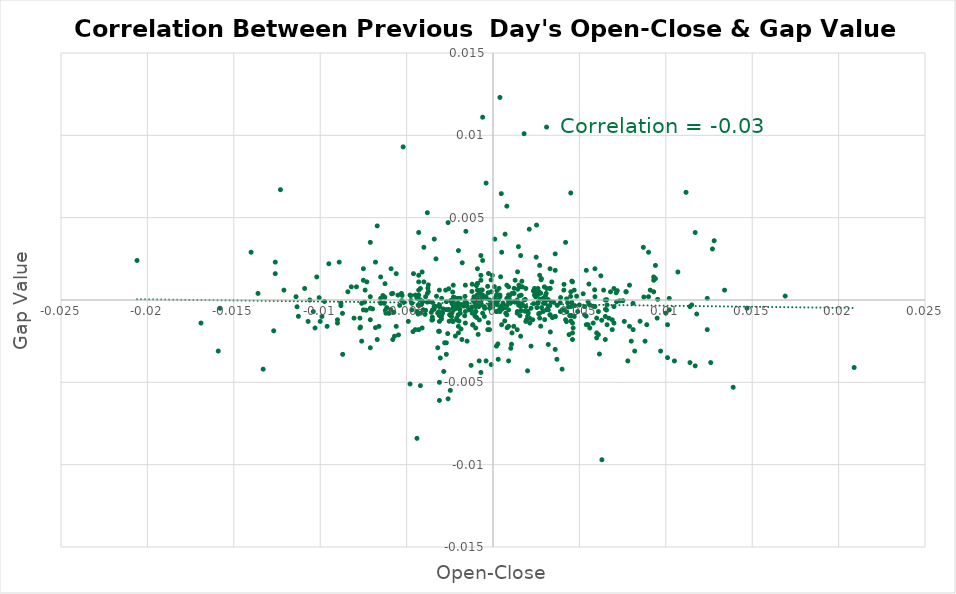
| Category | Series 0 |
|---|---|
| 0.0034399999999999986 | -0.001 |
| 0.0029200000000000337 | 0 |
| 0.0015299999999999203 | 0 |
| -0.004750000000000032 | 0 |
| -0.007340000000000013 | -0.001 |
| 0.0008199999999999319 | -0.002 |
| -0.003409999999998914 | -0.001 |
| 0.004730000000000012 | 0 |
| 0.004510000000001013 | -0.001 |
| 0.0016300000000000203 | 0 |
| 0.0025100000000000122 | 0 |
| -0.006229999999999958 | -0.001 |
| -0.005920000000000036 | -0.001 |
| -0.0011700000000000044 | -0.002 |
| 0.00713000000000108 | 0 |
| 0.0048399999999999554 | 0 |
| -0.009000000000000008 | -0.001 |
| 0.003029999999999977 | 0 |
| 0.0043199999999999905 | 0 |
| -0.005739999999999967 | -0.001 |
| -0.006249999999999978 | 0.001 |
| 0.005220000000000002 | 0 |
| -0.0043400000000000105 | -0.001 |
| 0.0016299999999999093 | -0.001 |
| 0.0025399999999999867 | 0 |
| 0.0007599999999999829 | 0 |
| -0.006020000000000025 | -0.001 |
| 0.0010299999999999754 | -0.003 |
| 0.0029599999999999627 | 0 |
| 0.004109999999999947 | 0.001 |
| 0.01690999999999898 | 0 |
| -0.010060000000001068 | 0 |
| -0.0009500000000000064 | 0 |
| -0.008040000000000047 | -0.001 |
| 0.0033199999999999896 | -0.002 |
| 0.0045399999999999885 | 0 |
| 0.007520000000000082 | 0 |
| -0.00026999999999999247 | -0.001 |
| -0.0015499999999999403 | 0 |
| -0.002970000000000028 | 0 |
| -9.999999999998899e-05 | -0.004 |
| -4.0000000000040004e-05 | 0.001 |
| 0.0009000000000000119 | 0 |
| -0.0023299999999999432 | 0 |
| -0.0020000000000000018 | 0 |
| -0.0042799999999999505 | 0 |
| 0.0016699999999999493 | 0.001 |
| 0.0002000000000010882 | -0.001 |
| -0.0024500000000010624 | 0 |
| 0.0015600000000000058 | -0.001 |
| -0.007669999999999955 | -0.002 |
| 0.0016599999999999948 | 0 |
| 0.0016599999999999948 | 0 |
| 0.0014300000000000423 | 0.001 |
| -0.0016400000000000858 | -0.001 |
| -0.0018299999999999983 | 0 |
| -0.011260000000000048 | -0.001 |
| 0.002989999999999937 | -0.001 |
| -0.0025399999999999867 | -0.001 |
| 0.00714999999999999 | 0 |
| 0.0046399999999999775 | -0.002 |
| -0.0008599999999999719 | -0.002 |
| -0.0029799999999999827 | -0.001 |
| 0.0009799999999999809 | 0 |
| -0.0019699999999999163 | -0.001 |
| 0.0020400000000000418 | -0.001 |
| 0.0010700000000000154 | -0.003 |
| -0.003049999999999997 | -0.004 |
| -0.0023100000000000342 | 0 |
| -0.0035399999999999876 | -0.001 |
| 0.002809999999999979 | 0 |
| 0.0042600000000000415 | 0 |
| -0.003929999999999989 | -0.001 |
| 0.008509999999998907 | -0.001 |
| -0.003149999999999986 | -0.002 |
| -0.004330000000000056 | 0 |
| -0.0012099999999999334 | 0 |
| 0.006240000000000023 | 0.001 |
| -0.012689999999999979 | -0.002 |
| -0.006369999999999987 | 0 |
| 0.011170000000000013 | 0.007 |
| -0.002849999999999908 | -0.004 |
| 0.006160000000000054 | -0.003 |
| -0.0012699999999999934 | -0.004 |
| 0.0003500000000010717 | 0.001 |
| 0.005390000000000006 | -0.001 |
| 0.0031999999999999806 | 0 |
| 0.0021299999999999653 | -0.001 |
| 0.0023500000000000743 | 0 |
| -0.004129999999999967 | 0 |
| 0.004269999999999996 | -0.001 |
| -0.0038000000000000256 | 0 |
| -0.0013700000000000934 | -0.001 |
| 0.005549999999999944 | 0.001 |
| -0.0009500000000000064 | -0.001 |
| 0.0012799999999999478 | 0.001 |
| 0.0002300000000000635 | 0.001 |
| -0.003570000000000073 | -0.001 |
| 0.003720000000001056 | 0 |
| -0.0020499999999999963 | 0 |
| -0.00040999999999991044 | 0 |
| -0.0029799999999999827 | -0.001 |
| -0.0030999999999999917 | 0 |
| -0.0023699999999999832 | -0.001 |
| -0.0017000000000000348 | 0 |
| 0.002970000000000028 | 0.001 |
| -0.0011700000000000044 | -0.002 |
| -0.0034999999999999476 | -0.001 |
| -0.0007899999999999574 | -0.001 |
| 0.0006800000000010131 | -0.001 |
| 9.00000000000345e-05 | 0 |
| 0.0017500000000000293 | 0 |
| 0.0005100000000000104 | -0.001 |
| 0.004370000000000096 | 0 |
| 0.003290000000000015 | 0 |
| -0.004249999999999976 | 0 |
| 0.0045600000000000085 | 0 |
| -0.0012199999999999989 | 0.001 |
| -0.00027999999999994696 | 0 |
| 0.004490000000001104 | 0 |
| -0.0022900000000000142 | 0 |
| -0.0022199999999999998 | 0 |
| -0.0027400000000000757 | 0.001 |
| 0.0025200000000000777 | 0.005 |
| -0.0010399999999999299 | -0.001 |
| -0.0024699999999999722 | -0.005 |
| -0.0021100000000000563 | 0 |
| -0.00019000000000002348 | 0 |
| -0.005159999999999942 | 0 |
| 0.0007899999999999574 | 0 |
| -0.0017800000000000038 | 0.002 |
| 0.003190000000000026 | 0 |
| -0.0016199999999989556 | 0 |
| -0.0029200000000000337 | -0.001 |
| 0.0014700000000000824 | 0.003 |
| -0.0037399999999999656 | 0.001 |
| -0.003330000000000055 | 0 |
| 0.0012099999999989342 | 0 |
| 0.002610000000000001 | 0 |
| -0.008799999999999919 | 0 |
| 0.0030800000000000827 | 0 |
| -0.0031300000000010764 | -0.001 |
| -0.011340000000000017 | 0 |
| -0.0007700000000000484 | 0.001 |
| 0.007189999999999919 | 0.001 |
| 0.0050000000000000044 | 0 |
| 0.0027599999999999847 | -0.002 |
| 0.00047999999999892573 | 0.006 |
| 0.0027199999999989455 | 0 |
| -0.005470000000000086 | -0.002 |
| 0.003130000000000077 | -0.001 |
| 0.00027999999999994696 | -0.001 |
| -0.0007800000000000029 | 0 |
| -0.0022600000000000398 | -0.001 |
| 0.0006800000000000139 | 0 |
| 0.0027599999999999847 | 0 |
| -0.0009599999999999609 | 0.001 |
| 0.00027999999999994696 | -0.003 |
| 0.003909999999999969 | 0 |
| 0.009530000000001038 | 0 |
| 0.007330000000000059 | 0 |
| -0.007439999999998892 | 0 |
| -0.00539999999999996 | 0 |
| 0.008110000000000062 | -0.002 |
| -0.003510000000000013 | 0 |
| -0.0023600000000000287 | 0 |
| -0.006260000000000043 | 0 |
| -0.0014799999999989266 | 0 |
| -0.003770000000000051 | 0.001 |
| -0.005280000000001062 | 0 |
| -0.006149999999999989 | 0 |
| 0.0035200000000000786 | 0 |
| 0.0026399999999999757 | -0.001 |
| -2.0000000000020002e-05 | 0 |
| 0.0027800000000000047 | 0.001 |
| -0.0001100000000010537 | 0.001 |
| -0.0011700000000000044 | 0 |
| -0.0008199999999999319 | 0 |
| -0.002890000000000059 | -0.001 |
| 0.005789999999999962 | 0 |
| -0.0006200000000000649 | 0.001 |
| 0.0009600000000010711 | 0 |
| -0.00031000000000003247 | 0.001 |
| 7.999999999996898e-05 | 0.001 |
| 0.008730000000000016 | 0 |
| -0.005870000000000042 | 0 |
| -0.0007000000000000339 | 0 |
| 0.0005800000000000249 | 0 |
| 0.0033700000000010943 | 0 |
| -0.003269999999999995 | 0 |
| 0.011790000000001077 | -0.001 |
| -0.008709999999999996 | -0.001 |
| 0.0014200000000000879 | 0.002 |
| -0.0023199999999999887 | -0.001 |
| 0.00012000000000000899 | 0 |
| 0.0026800000000000157 | 0 |
| 0.00021999999999999797 | 0 |
| -0.004630000000000023 | -0.002 |
| 0.0012199999999999989 | 0 |
| 0.0024699999999999722 | 0 |
| 0.0020199999999999108 | -0.001 |
| 0.0065800000000010295 | 0 |
| -0.0020000000000000018 | 0 |
| 0.005879999999999996 | 0.001 |
| -0.006970000000000032 | -0.001 |
| 0.0018500000000000183 | -0.001 |
| 0.0023400000000000087 | 0.001 |
| -0.003510000000000013 | -0.001 |
| 0.00021999999999999797 | 0 |
| -0.0007300000000010076 | 0 |
| -0.0021799999999999597 | -0.002 |
| -0.0030999999999999917 | -0.001 |
| -0.0040999999999999925 | 0 |
| -0.0016100000000000003 | 0 |
| 0.0019299999999999873 | -0.001 |
| -0.0020200000000000218 | -0.001 |
| 0.004530000000000034 | -0.001 |
| -0.009749999999999925 | 0 |
| -0.0019200000000000328 | -0.001 |
| -0.00048000000000003595 | -0.001 |
| -0.00273000000000001 | -0.001 |
| -0.004070000000001017 | 0 |
| 0.0015199999999999658 | 0 |
| -0.006800000000000028 | -0.002 |
| 0.0007399999999999629 | -0.001 |
| -0.0039000000000000146 | -0.001 |
| -0.0007700000000010476 | 0 |
| -0.0008300000000011076 | 0 |
| -0.0026199999999999557 | -0.002 |
| -0.0015700000000000713 | 0.004 |
| -0.0010200000000000209 | 0 |
| 0.0044399999999999995 | -0.001 |
| 0.0013499999999999623 | 0 |
| 0.00043999999999999595 | 0.001 |
| -0.0021399999999999197 | 0 |
| -0.0037399999999999656 | 0.001 |
| -0.0023699999999999832 | -0.001 |
| 0.004560000000001008 | 0.001 |
| 0.002569999999999961 | 0 |
| -0.005260000000000042 | 0 |
| -0.002569999999999961 | -0.001 |
| -0.0011999999999999789 | 0.001 |
| 0.00048000000000003595 | 0 |
| -0.0018500000000000183 | -0.002 |
| 0.00389000000000006 | 0 |
| 0.0014100000000000223 | -0.001 |
| 0.004250000000000087 | -0.001 |
| 0.006290000000000018 | -0.001 |
| 0.0014800000000000368 | 0 |
| -0.0040400000000000436 | -0.001 |
| -0.0025600000000000067 | 0.001 |
| 0.006570000000000076 | -0.001 |
| 0.006510000000000016 | -0.001 |
| 0.0012199999999999989 | 0.001 |
| -0.0009500000000000064 | 0 |
| 0.0018700000000010375 | 0 |
| -0.004749999999999921 | 0 |
| -0.00025999999999992696 | 0.002 |
| -0.0023000000000000798 | 0 |
| 0.0021999999999999797 | 0 |
| 0.0022999999999999687 | -0.001 |
| 0.010199999999999987 | 0 |
| -0.0019000000000000128 | 0 |
| 0.005299999999999971 | 0 |
| 0.006099999999999994 | -0.002 |
| 0.0046999999999999265 | 0.001 |
| 0.0008999999999999009 | 0 |
| -0.00990000000000002 | -0.001 |
| 0.0030000000000000027 | 0 |
| 0.00539999999999996 | 0.002 |
| -0.00880000000000003 | 0 |
| -0.0048000000000000265 | -0.005 |
| 0.013900000000000023 | -0.005 |
| -0.0034000000000000696 | 0.004 |
| 0.005499999999999949 | 0 |
| -0.013600000000000056 | 0 |
| 0.0040000000000000036 | -0.001 |
| 0.00040000000000006697 | 0 |
| 0.00539999999999996 | -0.002 |
| 0.009499999999999953 | -0.001 |
| 0.0020000000000000018 | -0.001 |
| 0.0026999999999999247 | -0.001 |
| -0.0030999999999999917 | -0.006 |
| -0.0047000000000000375 | -0.001 |
| -0.0018999999999989026 | -0.001 |
| 0.0018999999999989026 | 0.001 |
| 0.0039000000000000146 | -0.001 |
| -0.010700000000000043 | -0.001 |
| -0.008700000000000041 | -0.003 |
| 0.011399999999999966 | 0 |
| 0.0009000000000000119 | 0.001 |
| -9.999999999998899e-05 | 0 |
| 0.013399999999999967 | 0.001 |
| 0.0 | 0 |
| -0.00040000000000006697 | 0 |
| 0.012400000000000078 | -0.002 |
| 0.005900000000000016 | 0.002 |
| -0.0027999999999999137 | -0.003 |
| -0.0041999999999999815 | 0.001 |
| -0.0046999999999999265 | 0 |
| 0.009299999999999975 | 0.001 |
| 0.00029999999999996696 | 0 |
| 0.0030999999999999917 | 0 |
| -0.0044000000000000705 | -0.001 |
| -0.00019999999999997797 | -0.001 |
| 0.010099999999999998 | -0.001 |
| -0.005600000000000049 | -0.002 |
| -0.0010000000000000009 | -0.001 |
| 0.006000000000000005 | -0.001 |
| -0.007699999999999929 | -0.001 |
| -0.0023999999999989585 | 0 |
| -0.0027000000000000357 | 0 |
| -0.0024999999999999467 | -0.001 |
| -0.0020999999999999908 | -0.001 |
| 0.010700000000000043 | 0.002 |
| -0.00029999999999996696 | -0.002 |
| 0.002100000000000102 | -0.001 |
| -0.0019000000000000128 | 0 |
| -0.007500000000000062 | -0.001 |
| -0.0009000000000000119 | 0.001 |
| 0.006900000000001016 | -0.001 |
| 0.0032999999999999696 | 0.001 |
| 0.000200000000000089 | -0.003 |
| 0.011700000000000044 | -0.004 |
| 0.008199999999999985 | -0.003 |
| 0.0027000000000000357 | -0.001 |
| 0.0026999999999999247 | 0.002 |
| 0.006799999999998918 | 0 |
| 0.00039999999999895675 | 0 |
| 0.006099999999999994 | -0.001 |
| 0.0044999999999999485 | 0 |
| -0.0020999999999999908 | -0.001 |
| 0.005800000000000027 | -0.001 |
| -0.0044000000000000705 | 0 |
| 0.0020999999999999908 | 0.004 |
| 0.001400000000001067 | -0.001 |
| -0.0040000000000000036 | 0.001 |
| 0.007899999999999907 | -0.002 |
| -0.012600000000001055 | 0.002 |
| 0.006500000000000061 | -0.001 |
| 0.00660000000000005 | 0 |
| -0.0010000000000000009 | 0 |
| -0.005499999999999949 | 0 |
| -0.0030999999999999917 | 0.001 |
| 0.000300000000000078 | -0.004 |
| -0.0004999999999999449 | -0.001 |
| 0.010499999999998955 | -0.004 |
| -0.0011999999999999789 | -0.001 |
| -0.008199999999999985 | 0.001 |
| 0.0046000000000000485 | -0.002 |
| 0.00040000000000006697 | 0 |
| 0.0013999999999999568 | 0 |
| 0.0025000000000000577 | 0.001 |
| 0.005599999999999938 | -0.002 |
| 0.0036999999999999256 | -0.004 |
| -0.005299999999999971 | 0 |
| -0.0032999999999999696 | 0.002 |
| -0.007499999999999951 | 0.001 |
| 0.004000000000001003 | -0.004 |
| -0.0038000000000000256 | 0 |
| 0.0008000000000000229 | 0.001 |
| 0.009099999999999997 | 0.001 |
| 0.012400000000001077 | 0 |
| 0.0020999999999989916 | -0.001 |
| 0.006400000000000072 | 0.001 |
| 0.006500000000000061 | -0.002 |
| -0.0030999999999999917 | -0.001 |
| 0.0019000000000000128 | -0.001 |
| -0.0011999999999999789 | -0.001 |
| -0.0004999999999999449 | 0 |
| -0.0007000000000000339 | 0 |
| -0.0022999999999999687 | 0 |
| 0.0018000000000000238 | 0 |
| -0.0048000000000000265 | 0 |
| 0.00019999999999897877 | -0.001 |
| -0.0018000000000000238 | 0 |
| -0.0010999999999999899 | 0 |
| 0.0008000000000000229 | -0.001 |
| 0.0024000000000000687 | 0 |
| 0.00019999999999997797 | 0 |
| -0.0007000000000000339 | 0 |
| -0.0006000000000000449 | 0 |
| -0.0006000000000000449 | 0 |
| 0.0010000000000000009 | 0 |
| -0.0009000000000000119 | 0.001 |
| -0.0015999999999999348 | -0.001 |
| -0.000200000000000089 | 0 |
| 0.0015999999999989356 | 0 |
| -0.006200000000000094 | -0.001 |
| 0.0010999999999999899 | 0 |
| -0.0046000000000000485 | 0.002 |
| 0.0009000000000000119 | -0.002 |
| 0.0011999999999999789 | -0.002 |
| 0.0031999999999999806 | -0.003 |
| 0.0030999999999999917 | -0.001 |
| -0.005900000000000016 | 0.002 |
| -0.0010000000000000009 | -0.001 |
| 0.0030999999999999917 | 0.001 |
| 0.007000000000001005 | 0.001 |
| 0.0032999999999999696 | -0.001 |
| -0.010399999999999965 | -0.001 |
| -0.0042999999999999705 | 0 |
| 0.0010999999999999899 | -0.002 |
| -0.006300000000000083 | 0 |
| -0.0040999999999999925 | -0.002 |
| -0.0042999999999999705 | 0.001 |
| -0.0016000000000000458 | 0.001 |
| 0.005900000000000016 | 0 |
| -0.005799999999999916 | 0 |
| 0.007000000000000006 | 0 |
| 0.0023999999999999577 | 0.001 |
| 0.0029000000000000137 | 0 |
| -0.0049000000000000155 | -0.001 |
| -0.0008000000000000229 | -0.004 |
| -0.0039000000000010138 | 0 |
| 0.0047000000000000375 | -0.001 |
| 0.0043999999999999595 | -0.002 |
| 0.0018000000000000238 | 0.01 |
| -0.005600000000000049 | 0.002 |
| 0.0016000000000000458 | 0.003 |
| -0.0010999999999999899 | 0 |
| -0.0045000000000000595 | 0 |
| -0.009599999999999942 | -0.002 |
| 0.0032999999999999696 | 0.001 |
| -0.0030000000000000027 | -0.001 |
| -9.999999999998899e-05 | 0 |
| 0.012700000000001044 | 0.003 |
| 0.007600000000000051 | -0.001 |
| 0.014700000000000046 | 0 |
| -0.0006000000000000449 | 0.002 |
| 0.008099999999999996 | 0 |
| 0.006299999999999972 | -0.01 |
| 0.008700000000000041 | 0.003 |
| 0.009299999999999975 | 0 |
| 0.009000000000000008 | 0.003 |
| 0.006599999999999939 | -0.002 |
| -0.007100000000000106 | -0.001 |
| 0.0015000000000000568 | 0.001 |
| 0.0025999999999999357 | 0 |
| 0.0032000000000000917 | -0.001 |
| 0.0045999999999999375 | -0.001 |
| -0.000600000000000156 | -0.001 |
| -0.0009000000000001229 | 0 |
| -0.0030999999999998806 | -0.005 |
| 0.0035999999999998256 | -0.003 |
| 0.0019000000000000128 | 0 |
| -0.0032000000000000917 | -0.003 |
| 0.006000000000000005 | -0.002 |
| -0.0031000000000001027 | -0.001 |
| 0.0027999999999999137 | 0.001 |
| 0.0028999999999999027 | -0.001 |
| 0.0033000000000000806 | -0.001 |
| 0.005600000000000049 | 0 |
| -0.0020000000000000018 | 0.003 |
| -0.0005999999999999339 | 0 |
| 0.00770000000000004 | 0 |
| -0.0041999999999999815 | -0.001 |
| -0.0015000000000000568 | 0 |
| 0.00029999999999996696 | 0 |
| -0.007600000000000051 | 0 |
| -0.000700000000000145 | 0.001 |
| 0.0016000000000000458 | 0.001 |
| 0.007699999999999818 | 0 |
| -0.0017999999999998018 | -0.002 |
| 0.0036000000000000476 | -0.001 |
| 0.0033000000000000806 | 0.002 |
| 0.006000000000000005 | -0.002 |
| 0.006699999999999928 | -0.001 |
| -0.0026000000000001577 | -0.001 |
| -0.0006999999999999229 | 0.001 |
| -0.010299999999999976 | -0.002 |
| -0.0026999999999999247 | -0.003 |
| 0.0036000000000000476 | 0.002 |
| 0.009299999999999864 | 0.001 |
| -0.00020000000000020002 | -0.002 |
| -0.01089999999999991 | 0.001 |
| -0.009000000000000119 | -0.001 |
| 0.0045999999999999375 | -0.002 |
| -0.009500000000000064 | 0.002 |
| 0.007000000000000117 | -0.001 |
| -0.02059999999999995 | 0.002 |
| -0.0020000000000000018 | -0.002 |
| -0.007100000000000106 | 0.004 |
| -0.00039999999999895675 | 0.007 |
| 0.0025999999999999357 | 0 |
| 0.0008000000000000229 | 0.006 |
| 0.004899999999999904 | -0.001 |
| 0.0040999999999999925 | -0.001 |
| 0.008799999999999919 | -0.002 |
| -0.010000000000000009 | -0.001 |
| -0.0032000000000000917 | -0.001 |
| 0.006500000000000172 | 0 |
| -0.0015999999999998238 | -0.001 |
| 0.0031000000000001027 | 0.01 |
| -0.00649999999999995 | 0 |
| -0.007099999999999884 | 0 |
| 0.006899999999999906 | -0.002 |
| 0.007900000000000018 | 0.001 |
| 0.0034000000000000696 | 0.001 |
| 0.0044999999999999485 | 0.006 |
| 0.009400000000000075 | 0.001 |
| -0.006599999999999939 | -0.002 |
| -0.0044999999999999485 | -0.002 |
| -0.007100000000000106 | 0 |
| 0.0009000000000001229 | -0.004 |
| 0.0021999999999999797 | -0.003 |
| -0.007299999999999862 | 0.001 |
| -0.0008999999999999009 | 0 |
| -0.0042999999999999705 | 0.001 |
| -0.0033999999999998476 | 0 |
| 0.0006999999999999229 | 0.004 |
| -0.0005999999999999339 | 0.011 |
| -0.0023999999999999577 | -0.001 |
| -0.012299999999999978 | 0.007 |
| 0.0041999999999999815 | 0.003 |
| 0.0013999999999998458 | 0 |
| -0.01330000000000009 | -0.004 |
| -0.016900000000000137 | -0.001 |
| -0.0020000000000000018 | -0.002 |
| 0.011500000000000066 | 0 |
| 0.0025000000000000577 | 0.003 |
| -0.0025999999999999357 | -0.006 |
| 0.011400000000000077 | -0.004 |
| 0.007800000000000029 | -0.004 |
| -0.010199999999999987 | 0.001 |
| -0.007600000000000051 | -0.002 |
| -0.0023000000000001908 | 0.001 |
| 0.0004999999999999449 | -0.002 |
| 9.999999999998899e-05 | 0.004 |
| -0.0014999999999998348 | -0.002 |
| 0.008000000000000007 | -0.002 |
| 0.0020000000000000018 | -0.004 |
| -0.007400000000000073 | 0.001 |
| 0.005300000000000082 | -0.001 |
| -0.005700000000000038 | -0.002 |
| 0.010199999999999987 | -0.001 |
| -0.0030999999999998806 | 0 |
| -0.006800000000000139 | 0.002 |
| 0.0013999999999998458 | -0.002 |
| 0.009000000000000119 | 0 |
| -0.007500000000000062 | 0.002 |
| -0.0035000000000000586 | -0.001 |
| 0.0017000000000000348 | 0.001 |
| -0.0020999999999999908 | 0 |
| -0.010599999999999943 | 0 |
| -0.00649999999999995 | 0.001 |
| -0.005800000000000027 | -0.002 |
| -0.011400000000000077 | 0 |
| -0.0121 | 0.001 |
| -0.0009000000000001229 | 0.001 |
| -0.007100000000000106 | -0.003 |
| -0.0024999999999999467 | -0.001 |
| -0.00039999999999995595 | -0.004 |
| 0.0008999999999999009 | -0.001 |
| -0.0041999999999999815 | -0.005 |
| -0.0042999999999999705 | -0.002 |
| 0.009399999999999964 | 0.002 |
| -0.0027000000000000357 | -0.003 |
| -0.006699999999999928 | -0.002 |
| -0.0006999999999999229 | -0.004 |
| 0.0012999999999999678 | 0 |
| -0.0010000000000000009 | -0.002 |
| -0.015900000000000025 | -0.003 |
| 0.012799999999999923 | 0.004 |
| 0.0040999999999999925 | 0.001 |
| 0.011699999999999933 | 0.004 |
| 0.0008000000000001339 | 0 |
| -0.004100000000001103 | 0.002 |
| -0.004300000000001081 | 0.004 |
| -0.0009000000000000119 | 0.002 |
| -0.0025999999999999357 | 0.005 |
| -0.00649999999999995 | 0 |
| -0.012600000000000056 | 0.002 |
| -0.0006999999999999229 | 0.002 |
| -0.0040000000000000036 | 0.003 |
| -0.007699999999999929 | -0.002 |
| -0.014000000000000012 | 0.003 |
| -0.0044000000000000705 | -0.008 |
| 0.0041999999999999815 | -0.001 |
| -0.0037000000000000366 | 0 |
| -0.0042999999999999705 | 0.001 |
| -0.0009000000000000119 | 0 |
| 0.012600000000001055 | -0.004 |
| -0.0008000000000010221 | 0 |
| 0.0035999999999999366 | -0.001 |
| -0.006300000000000083 | 0 |
| -0.005199999999999982 | 0.009 |
| -0.0006999999999999229 | 0.003 |
| 0.02089999999999992 | -0.004 |
| 0.0016000000000000458 | -0.002 |
| -0.015799999999999925 | 0 |
| 0.010000000000000009 | -0.001 |
| 0.00039999999999995595 | 0.012 |
| 0.005499999999999949 | -0.002 |
| -0.0030999999999999917 | -0.002 |
| 0.009699999999999931 | -0.003 |
| -0.0037999999999999146 | 0.005 |
| 0.0027000000000000357 | 0.002 |
| 0.0045999999999999375 | 0.001 |
| 0.005900000000000016 | 0 |
| 0.0004999999999999449 | 0.003 |
| -0.007900000000000018 | 0.001 |
| -0.008399999999999963 | 0.001 |
| -0.008900000000000019 | 0.002 |
| 0.0026000000000000467 | 0.001 |
| 0.00040000000000006697 | -0.001 |
| 0.010099999999998999 | -0.003 |
| 0.0036000000000000476 | 0.003 |
| 0.008900000000000019 | -0.002 |
| -0.0067000000000010385 | 0.005 |